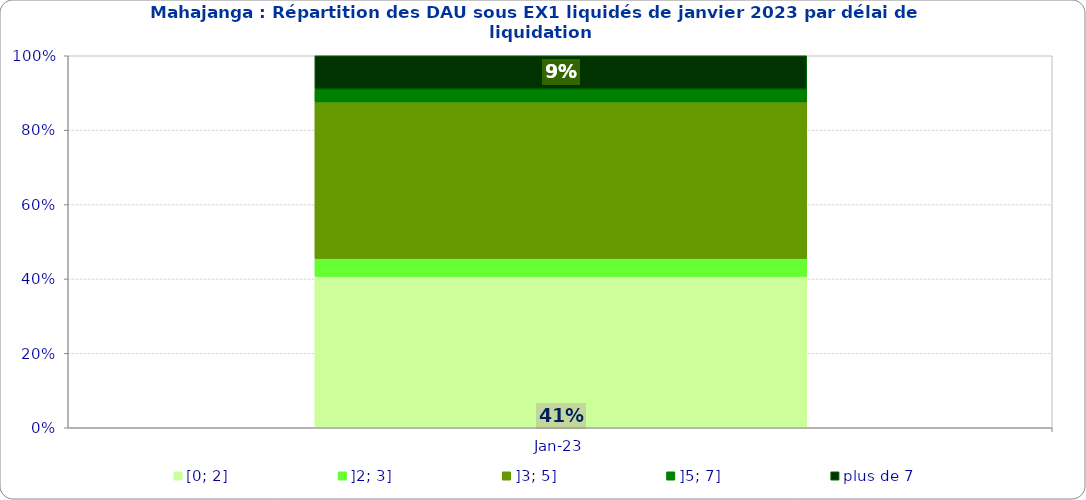
| Category | [0; 2] | ]2; 3] | ]3; 5] | ]5; 7] | plus de 7 |
|---|---|---|---|---|---|
| 2023-01-01 | 0.407 | 0.048 | 0.421 | 0.034 | 0.09 |